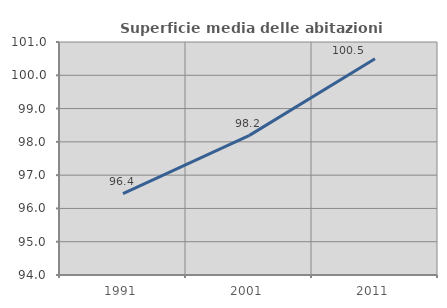
| Category | Superficie media delle abitazioni occupate |
|---|---|
| 1991.0 | 96.444 |
| 2001.0 | 98.186 |
| 2011.0 | 100.499 |